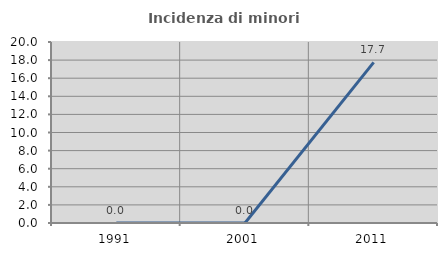
| Category | Incidenza di minori stranieri |
|---|---|
| 1991.0 | 0 |
| 2001.0 | 0 |
| 2011.0 | 17.742 |